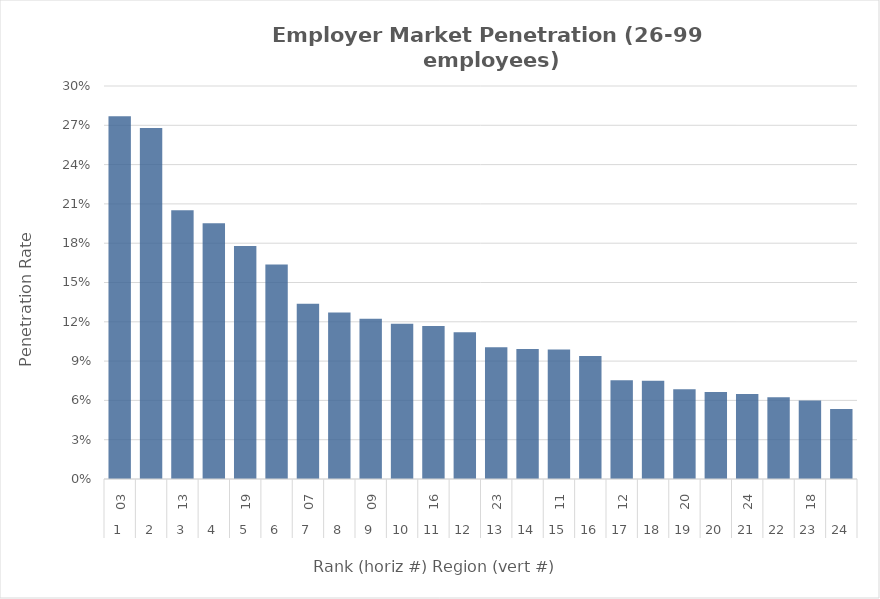
| Category | Rate |
|---|---|
| 0 | 0.277 |
| 1 | 0.268 |
| 2 | 0.205 |
| 3 | 0.195 |
| 4 | 0.178 |
| 5 | 0.164 |
| 6 | 0.134 |
| 7 | 0.127 |
| 8 | 0.122 |
| 9 | 0.119 |
| 10 | 0.117 |
| 11 | 0.112 |
| 12 | 0.101 |
| 13 | 0.099 |
| 14 | 0.099 |
| 15 | 0.094 |
| 16 | 0.075 |
| 17 | 0.075 |
| 18 | 0.068 |
| 19 | 0.066 |
| 20 | 0.065 |
| 21 | 0.062 |
| 22 | 0.06 |
| 23 | 0.053 |